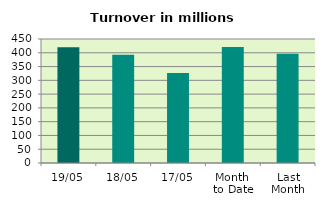
| Category | Series 0 |
|---|---|
| 19/05 | 420.42 |
| 18/05 | 393.114 |
| 17/05 | 326.502 |
| Month 
to Date | 420.856 |
| Last
Month | 396.429 |